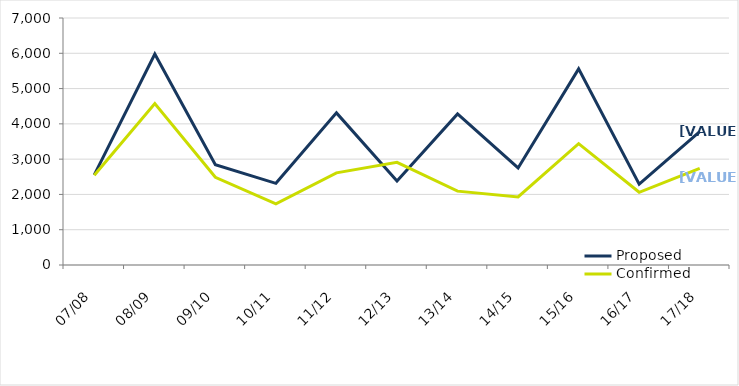
| Category | Proposed | Confirmed |
|---|---|---|
| 07/08 | 2555 | 2541 |
| 08/09 | 5981 | 4576 |
| 09/10 | 2844 | 2486 |
| 10/11 | 2315 | 1733 |
| 11/12 | 4311 | 2612 |
| 12/13 | 2382 | 2910 |
| 13/14 | 4283 | 2093 |
| 14/15 | 2751 | 1928 |
| 15/16 | 5559 | 3440 |
| 16/17 | 2291 | 2061 |
| 17/18 | 3781 | 2741 |